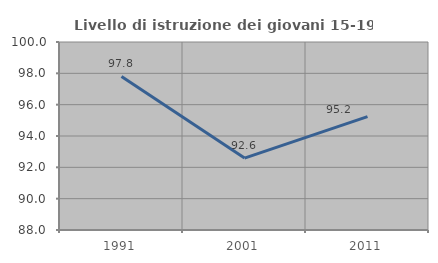
| Category | Livello di istruzione dei giovani 15-19 anni |
|---|---|
| 1991.0 | 97.802 |
| 2001.0 | 92.593 |
| 2011.0 | 95.238 |